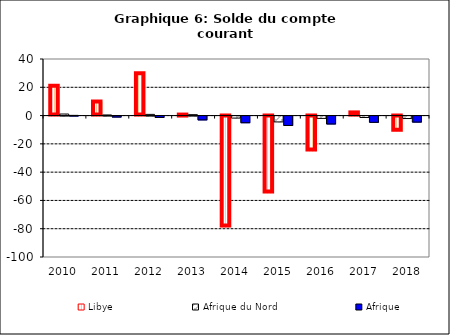
| Category | Libye | Afrique du Nord | Afrique |
|---|---|---|---|
| 2010.0 | 21.136 | 1.095 | 0.144 |
| 2011.0 | 9.916 | 0.439 | -0.706 |
| 2012.0 | 29.886 | 0.839 | -0.95 |
| 2013.0 | 0.019 | 0.638 | -2.715 |
| 2014.0 | -78.446 | -1.429 | -4.722 |
| 2015.0 | -54.355 | -4.138 | -6.65 |
| 2016.0 | -24.677 | -1.65 | -5.608 |
| 2017.0 | 2.237 | -1.011 | -4.418 |
| 2018.0 | -10.722 | -1.744 | -4.278 |